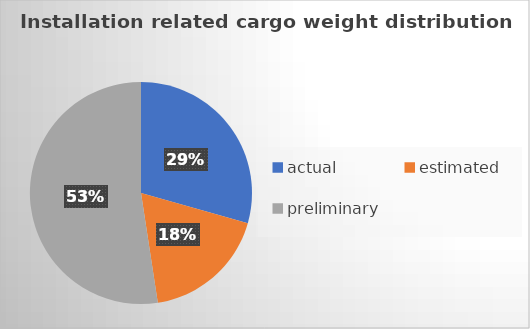
| Category | Series 0 |
|---|---|
| actual | 67801 |
| estimated | 41972 |
| preliminary | 120945 |